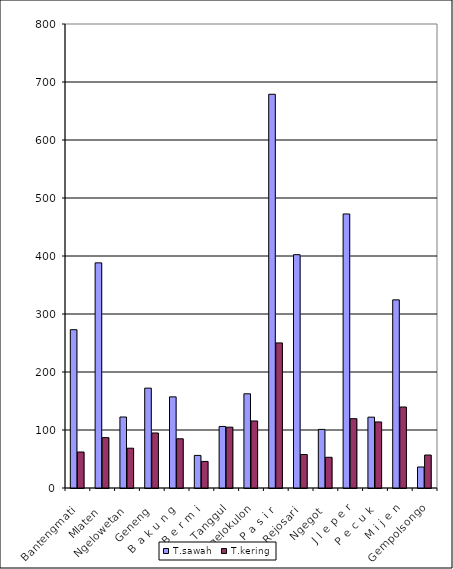
| Category | T.sawah | T.kering |
|---|---|---|
| Bantengmati | 272.94 | 62.06 |
| Mlaten | 388.16 | 86.84 |
| Ngelowetan | 122.39 | 68.61 |
| Geneng | 172.15 | 94.85 |
| B a k u n g | 157.12 | 84.88 |
| B e r m i | 56.19 | 45.81 |
| Tanggul | 106.11 | 104.89 |
| Ngelokulon | 162.42 | 115.58 |
| P a s i r | 678.86 | 250.14 |
| Rejosari | 402.27 | 57.73 |
| Ngegot | 101.04 | 52.96 |
| J l e p e r | 472.49 | 119.51 |
| P e c u k | 122.13 | 113.87 |
| M i j e n | 324.37 | 139.63 |
| Gempolsongo | 36.18 | 56.82 |